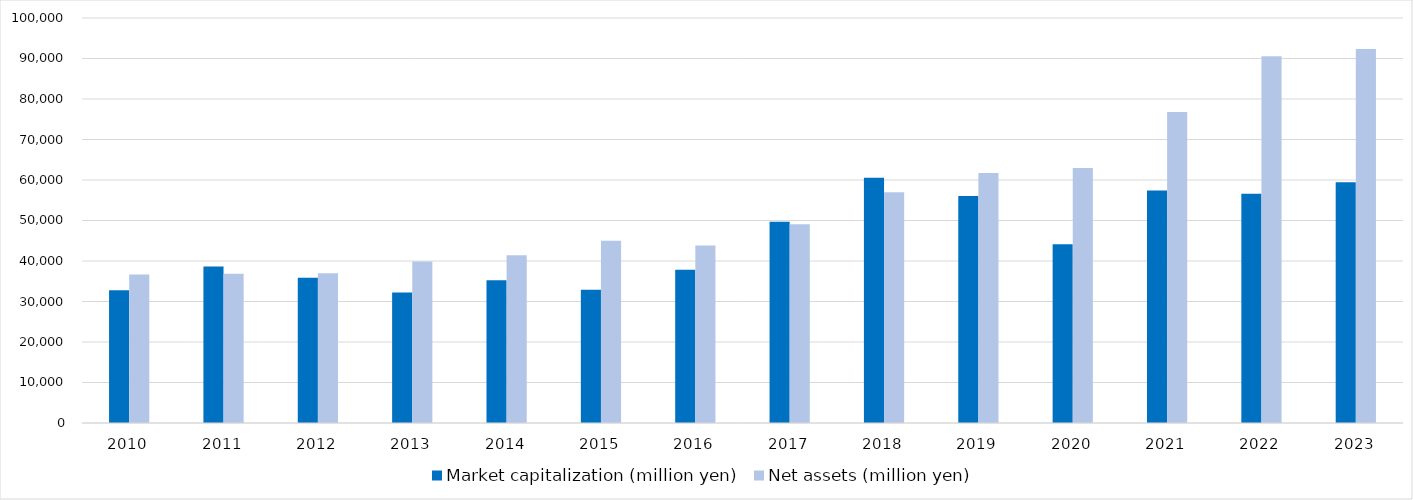
| Category | Market capitalization (million yen) | Net assets (million yen) |
|---|---|---|
| 2010 | 32764 | 36663 |
| 2011 | 38650 | 36839 |
| 2012 | 35888 | 36949 |
| 2013 | 32249 | 39870 |
| 2014 | 35260 | 41419 |
| 2015 | 32931 | 44984 |
| 2016 | 37842 | 43833 |
| 2017 | 49675 | 49086 |
| 2018 | 60545 | 56979 |
| 2019 | 56039 | 61741 |
| 2020 | 44143 | 62975 |
| 2021 | 57402 | 76771 |
| 2022 | 56597 | 90563 |
| 2023 | 59443 | 92318.111 |